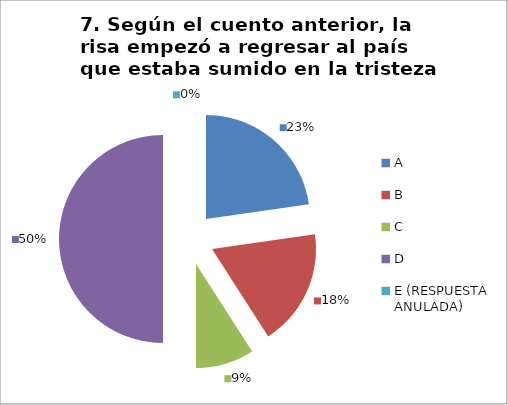
| Category | CANTIDAD DE RESPUESTAS PREGUNTA (7) | PORCENTAJE |
|---|---|---|
| A | 5 | 0.227 |
| B | 4 | 0.182 |
| C | 2 | 0.091 |
| D | 11 | 0.5 |
| E (RESPUESTA ANULADA) | 0 | 0 |